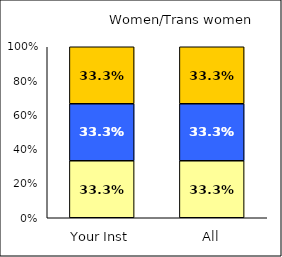
| Category | Low Science Identity | Average Science Identity | High Science Identity |
|---|---|---|---|
| Your Inst | 0.333 | 0.333 | 0.333 |
| All | 0.333 | 0.333 | 0.333 |